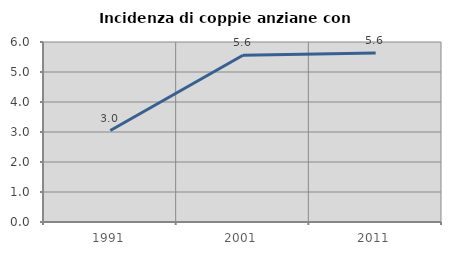
| Category | Incidenza di coppie anziane con figli |
|---|---|
| 1991.0 | 3.048 |
| 2001.0 | 5.557 |
| 2011.0 | 5.635 |